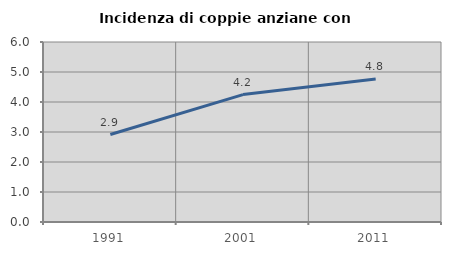
| Category | Incidenza di coppie anziane con figli |
|---|---|
| 1991.0 | 2.916 |
| 2001.0 | 4.247 |
| 2011.0 | 4.765 |